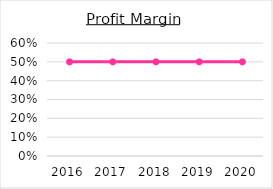
| Category | Series 0 |
|---|---|
| 2016.0 | 0.5 |
| 2017.0 | 0.5 |
| 2018.0 | 0.5 |
| 2019.0 | 0.5 |
| 2020.0 | 0.5 |